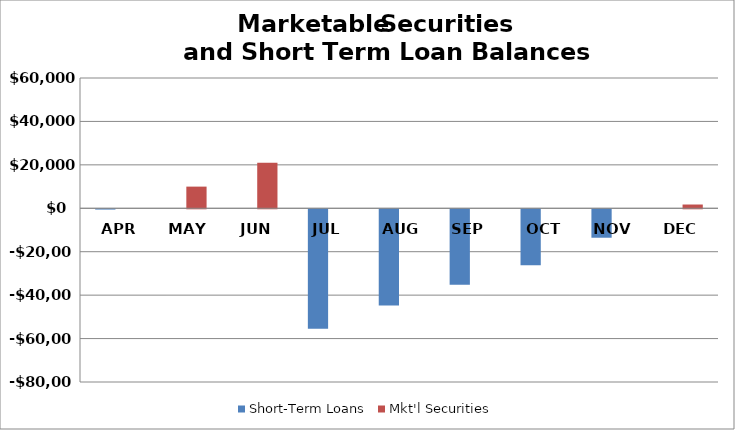
| Category | Short-Term Loans | Mkt'l Securities |
|---|---|---|
| APR | -132.6 | 0 |
| MAY | 0 | 9980.55 |
| JUN | 0 | 21020.85 |
| JUL | -54979.15 | 0 |
| AUG | -44260.15 | 0 |
| SEP | -34708.35 | 0 |
| OCT | -25753.15 | 0 |
| NOV | -13098.65 | 0 |
| DEC | 0 | 1736.45 |